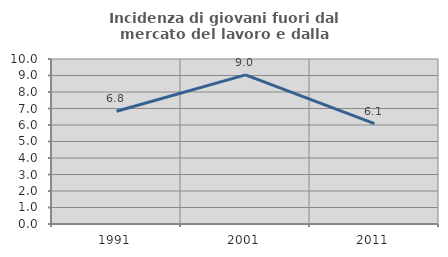
| Category | Incidenza di giovani fuori dal mercato del lavoro e dalla formazione  |
|---|---|
| 1991.0 | 6.829 |
| 2001.0 | 9.036 |
| 2011.0 | 6.081 |